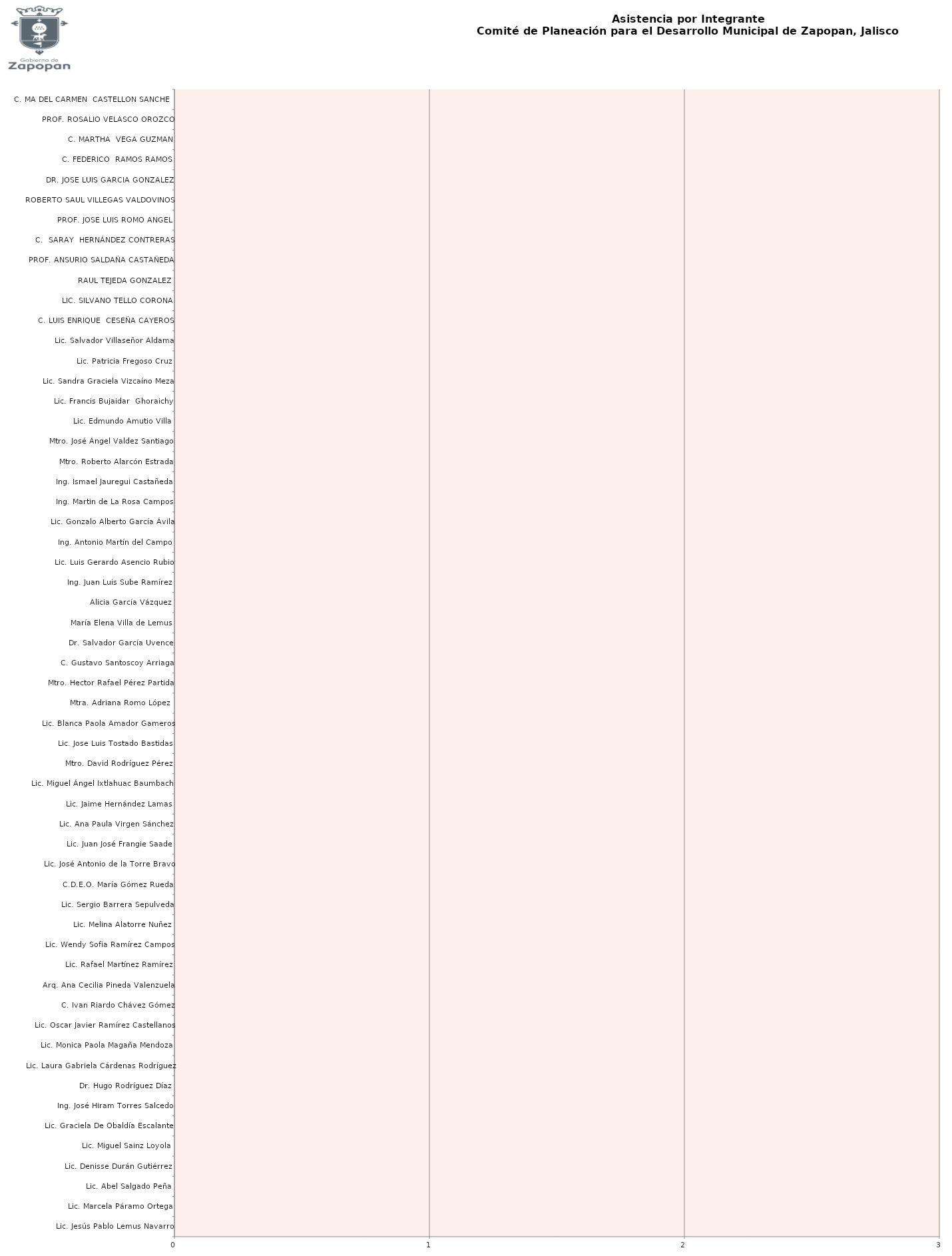
| Category | Series 0 |
|---|---|
| Lic. Jesús Pablo Lemus Navarro | 0 |
| Lic. Marcela Páramo Ortega | 0 |
| Lic. Abel Salgado Peña | 0 |
| Lic. Denisse Durán Gutiérrez | 0 |
| Lic. Miguel Sainz Loyola | 0 |
| Lic. Graciela De Obaldía Escalante | 0 |
| Ing. José Hiram Torres Salcedo | 0 |
| Dr. Hugo Rodríguez Díaz | 0 |
| Lic. Laura Gabriela Cárdenas Rodríguez | 0 |
| Lic. Monica Paola Magaña Mendoza | 0 |
| Lic. Oscar Javier Ramírez Castellanos | 0 |
| C. Ivan Riardo Chávez Gómez | 0 |
| Arq. Ana Cecilia Pineda Valenzuela | 0 |
| Lic. Rafael Martínez Ramírez | 0 |
| Lic. Wendy Sofia Ramírez Campos | 0 |
| Lic. Melina Alatorre Nuñez | 0 |
| Lic. Sergio Barrera Sepulveda | 0 |
| C.D.E.O. María Gómez Rueda | 0 |
| Lic. José Antonio de la Torre Bravo | 0 |
| Lic. Juan José Frangie Saade | 0 |
| Lic. Ana Paula Virgen Sánchez | 0 |
| Lic. Jaime Hernández Lamas | 0 |
| Lic. Miguel Ángel Ixtlahuac Baumbach | 0 |
| Mtro. David Rodríguez Pérez | 0 |
| Lic. Jose Luis Tostado Bastidas | 0 |
| Lic. Blanca Paola Amador Gameros | 0 |
| Mtra. Adriana Romo López  | 0 |
| Mtro. Hector Rafael Pérez Partida | 0 |
| C. Gustavo Santoscoy Arriaga | 0 |
| Dr. Salvador García Uvence | 0 |
| María Elena Villa de Lemus | 0 |
| Alicia García Vázquez | 0 |
| Ing. Juan Luis Sube Ramírez | 0 |
| Lic. Luis Gerardo Asencio Rubio | 0 |
| Ing. Antonio Martín del Campo | 0 |
| Lic. Gonzalo Alberto García Ávila | 0 |
| Ing. Martin de La Rosa Campos | 0 |
| Ing. Ismael Jauregui Castañeda | 0 |
| Mtro. Roberto Alarcón Estrada | 0 |
| Mtro. José Ángel Valdez Santiago | 0 |
| Lic. Edmundo Amutio Villa | 0 |
| Lic. Francis Bujaidar  Ghoraichy | 0 |
| Lic. Sandra Graciela Vizcaíno Meza | 0 |
| Lic. Patricia Fregoso Cruz | 0 |
| Lic. Salvador Villaseñor Aldama | 0 |
| C. LUIS ENRIQUE  CESEÑA CAYEROS | 0 |
| LIC. SILVANO TELLO CORONA | 0 |
| RAUL TEJEDA GONZALEZ | 0 |
| PROF. ANSURIO SALDAÑA CASTAÑEDA | 0 |
| C.  SARAY  HERNÁNDEZ CONTRERAS | 0 |
| PROF. JOSE LUIS ROMO ANGEL | 0 |
| ROBERTO SAUL VILLEGAS VALDOVINOS | 0 |
| DR. JOSE LUIS GARCIA GONZALEZ | 0 |
| C. FEDERICO  RAMOS RAMOS | 0 |
| C. MARTHA  VEGA GUZMAN | 0 |
| PROF. ROSALIO VELASCO OROZCO | 0 |
| C. MA DEL CARMEN  CASTELLON SANCHEZ | 0 |